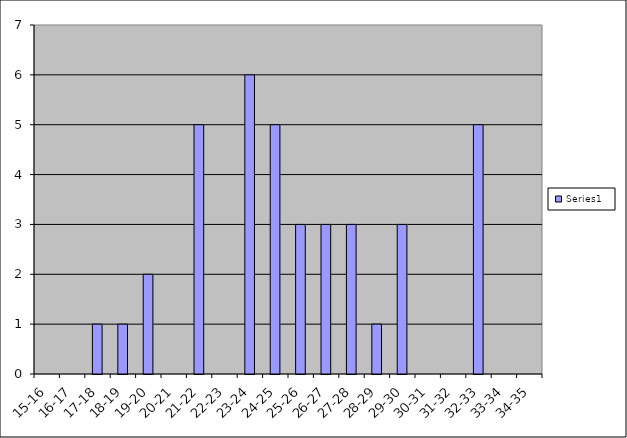
| Category | Series 0 |
|---|---|
| 15-16 | 0 |
| 16-17 | 0 |
| 17-18 | 1 |
| 18-19 | 1 |
| 19-20 | 2 |
| 20-21 | 0 |
| 21-22 | 5 |
| 22-23 | 0 |
| 23-24 | 6 |
| 24-25 | 5 |
| 25-26 | 3 |
| 26-27 | 3 |
| 27-28 | 3 |
| 28-29 | 1 |
| 29-30 | 3 |
| 30-31 | 0 |
| 31-32 | 0 |
| 32-33 | 5 |
| 33-34 | 0 |
| 34-35 | 0 |